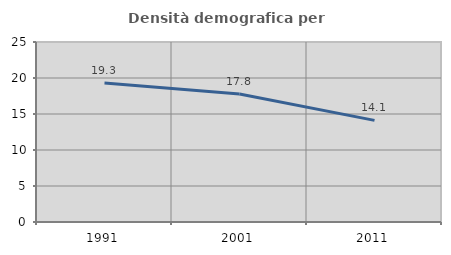
| Category | Densità demografica |
|---|---|
| 1991.0 | 19.302 |
| 2001.0 | 17.787 |
| 2011.0 | 14.118 |